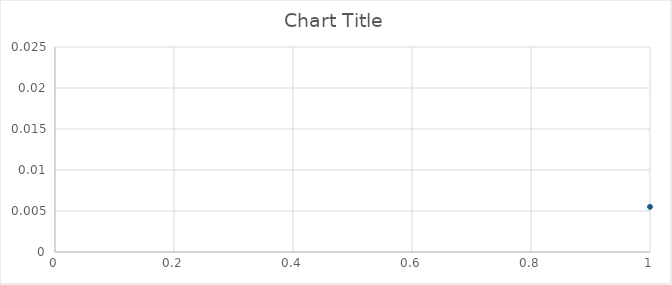
| Category | Series 0 |
|---|---|
| 0 | 0.006 |
| 1 | 0.007 |
| 2 | 0.007 |
| 3 | 0.008 |
| 4 | 0.009 |
| 5 | 0.016 |
| 6 | 0.018 |
| 7 | 0.02 |
| 8 | 0.02 |
| 9 | 0.021 |
| 10 | 0.021 |
| 11 | 0.022 |
| 12 | 0.022 |
| 13 | 0.022 |
| 14 | 0.02 |
| 15 | 0.02 |
| 16 | 0.02 |
| 17 | 0.018 |
| 18 | 0.017 |
| 19 | 0.017 |
| 20 | 0.014 |
| 21 | 0.012 |
| 22 | 0.007 |
| 23 | 0.006 |
| 24 | 0.006 |